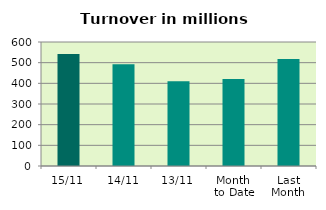
| Category | Series 0 |
|---|---|
| 15/11 | 541.613 |
| 14/11 | 492.814 |
| 13/11 | 409.57 |
| Month 
to Date | 421.08 |
| Last
Month | 517.71 |